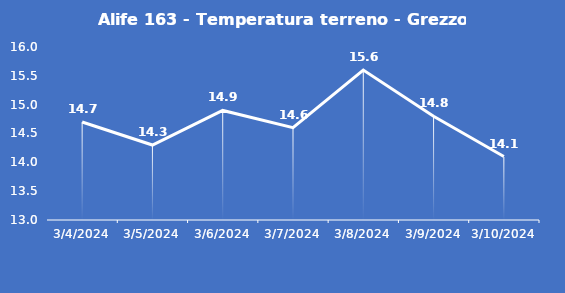
| Category | Alife 163 - Temperatura terreno - Grezzo (°C) |
|---|---|
| 3/4/24 | 14.7 |
| 3/5/24 | 14.3 |
| 3/6/24 | 14.9 |
| 3/7/24 | 14.6 |
| 3/8/24 | 15.6 |
| 3/9/24 | 14.8 |
| 3/10/24 | 14.1 |